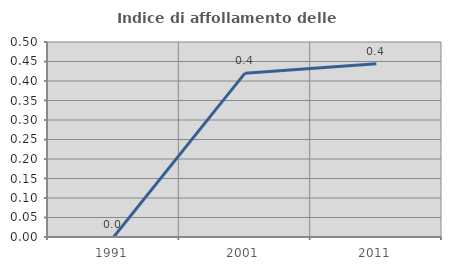
| Category | Indice di affollamento delle abitazioni  |
|---|---|
| 1991.0 | 0 |
| 2001.0 | 0.42 |
| 2011.0 | 0.444 |